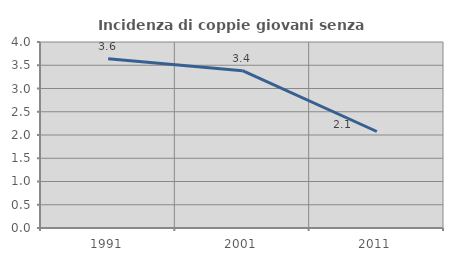
| Category | Incidenza di coppie giovani senza figli |
|---|---|
| 1991.0 | 3.641 |
| 2001.0 | 3.383 |
| 2011.0 | 2.075 |